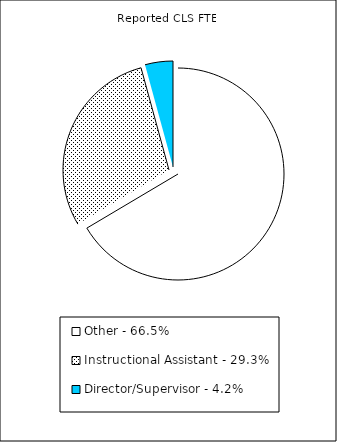
| Category | Reported FTE |
|---|---|
| Other - 66.5% | 30055.26 |
| Instructional Assistant - 29.3% | 13237.77 |
| Director/Supervisor - 4.2% | 1922.12 |